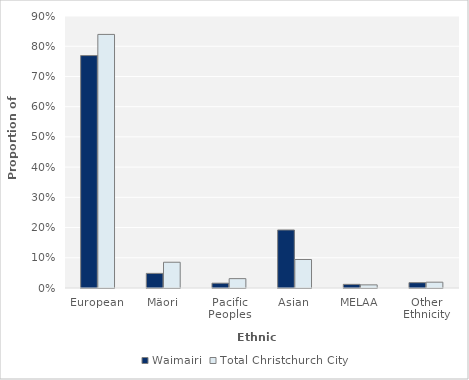
| Category | Waimairi | Total Christchurch City |
|---|---|---|
| European | 0.769 | 0.839 |
| Mäori | 0.048 | 0.085 |
| Pacific Peoples | 0.016 | 0.031 |
| Asian | 0.192 | 0.094 |
| MELAA | 0.012 | 0.01 |
| Other Ethnicity | 0.018 | 0.019 |